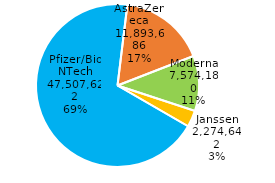
| Category | Series 0 |
|---|---|
| Pfizer/BioNTech | 47507622 |
| AstraZeneca | 11893686 |
| Moderna | 7574180 |
| Janssen | 2274642 |